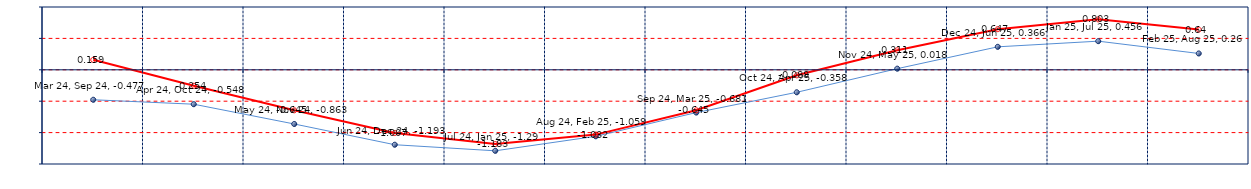
| Category | Last | Historical |
|---|---|---|
| Mar 24, Sep 24 | -0.477 | 0.159 |
| Apr 24, Oct 24 | -0.548 | -0.254 |
| May 24, Nov 24 | -0.863 | -0.645 |
| Jun 24, Dec 24 | -1.193 | -1.007 |
| Jul 24, Jan 25 | -1.29 | -1.183 |
| Aug 24, Feb 25 | -1.059 | -1.032 |
| Sep 24, Mar 25 | -0.681 | -0.645 |
| Oct 24, Apr 25 | -0.358 | -0.088 |
| Nov 24, May 25 | 0.018 | 0.311 |
| Dec 24, Jun 25 | 0.366 | 0.647 |
| Jan 25, Jul 25 | 0.456 | 0.803 |
| Feb 25, Aug 25 | 0.26 | 0.64 |